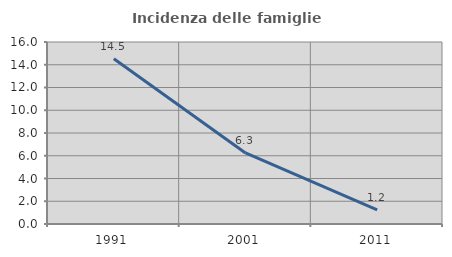
| Category | Incidenza delle famiglie numerose |
|---|---|
| 1991.0 | 14.521 |
| 2001.0 | 6.25 |
| 2011.0 | 1.247 |